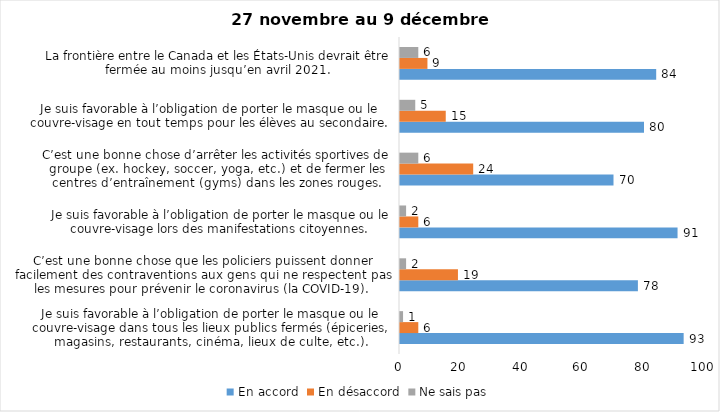
| Category | En accord | En désaccord | Ne sais pas |
|---|---|---|---|
| Je suis favorable à l’obligation de porter le masque ou le couvre-visage dans tous les lieux publics fermés (épiceries, magasins, restaurants, cinéma, lieux de culte, etc.). | 93 | 6 | 1 |
| C’est une bonne chose que les policiers puissent donner facilement des contraventions aux gens qui ne respectent pas les mesures pour prévenir le coronavirus (la COVID-19). | 78 | 19 | 2 |
| Je suis favorable à l’obligation de porter le masque ou le couvre-visage lors des manifestations citoyennes. | 91 | 6 | 2 |
| C’est une bonne chose d’arrêter les activités sportives de groupe (ex. hockey, soccer, yoga, etc.) et de fermer les centres d’entraînement (gyms) dans les zones rouges. | 70 | 24 | 6 |
| Je suis favorable à l’obligation de porter le masque ou le couvre-visage en tout temps pour les élèves au secondaire. | 80 | 15 | 5 |
| La frontière entre le Canada et les États-Unis devrait être fermée au moins jusqu’en avril 2021. | 84 | 9 | 6 |